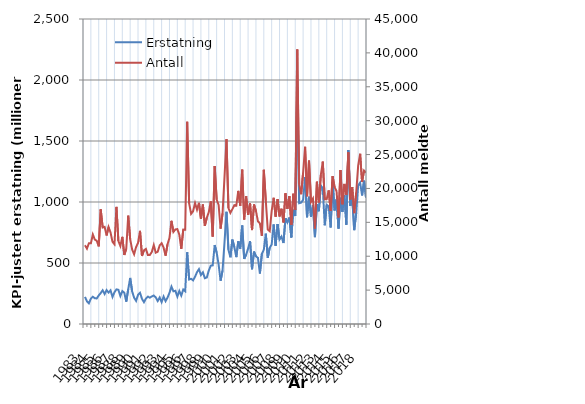
| Category | Erstatning |
|---|---|
| 1983.0 | 221.949 |
| nan | 185.917 |
| nan | 170.02 |
| nan | 208.268 |
| 1984.0 | 223.332 |
| nan | 211.256 |
| nan | 209.456 |
| nan | 234.278 |
| 1985.0 | 253.168 |
| nan | 276.72 |
| nan | 245.206 |
| nan | 278.097 |
| 1986.0 | 257.839 |
| nan | 275.898 |
| nan | 222.061 |
| nan | 259.862 |
| 1987.0 | 283.894 |
| nan | 280.151 |
| nan | 229.26 |
| nan | 269.731 |
| 1988.0 | 256.73 |
| nan | 183.009 |
| nan | 285.041 |
| nan | 377.599 |
| 1989.0 | 266.765 |
| nan | 215.61 |
| nan | 189.719 |
| nan | 239.351 |
| 1990.0 | 256.282 |
| nan | 206.18 |
| nan | 178.813 |
| nan | 208.132 |
| 1991.0 | 224.594 |
| nan | 215.946 |
| nan | 226.002 |
| nan | 233.658 |
| 1992.0 | 218.279 |
| nan | 188.082 |
| nan | 217.323 |
| nan | 179.335 |
| 1993.0 | 225.016 |
| nan | 187.263 |
| nan | 216.35 |
| nan | 255.948 |
| 1994.0 | 306.554 |
| nan | 267.998 |
| nan | 272.283 |
| nan | 224.429 |
| 1995.0 | 270.389 |
| nan | 232.615 |
| nan | 282.652 |
| nan | 268.364 |
| 1996.0 | 588.52 |
| nan | 364.421 |
| nan | 370.932 |
| nan | 357.735 |
| 1997.0 | 387.279 |
| nan | 424.973 |
| nan | 450.052 |
| nan | 401.55 |
| 1998.0 | 423.625 |
| nan | 375.292 |
| nan | 381.423 |
| nan | 438.403 |
| 1999.0 | 478.172 |
| nan | 480.494 |
| nan | 646.566 |
| nan | 585.551 |
| 2000.0 | 488.096 |
| nan | 354.465 |
| nan | 439.436 |
| nan | 670.004 |
| 2001.0 | 919.504 |
| nan | 608.715 |
| nan | 546.707 |
| nan | 691.697 |
| 2002.0 | 629.967 |
| nan | 548.133 |
| nan | 677.398 |
| nan | 617.261 |
| 2003.0 | 807.292 |
| nan | 533.752 |
| nan | 567.845 |
| nan | 618.583 |
| 2004.0 | 678.619 |
| nan | 448.657 |
| nan | 593.143 |
| nan | 554.406 |
| 2005.0 | 542.628 |
| nan | 414.1 |
| nan | 574.883 |
| nan | 609.232 |
| 2006.0 | 740.532 |
| nan | 543.078 |
| nan | 624.878 |
| nan | 651.921 |
| 2007.0 | 816.008 |
| nan | 641.555 |
| nan | 819.694 |
| nan | 693.036 |
| 2008.0 | 716.689 |
| nan | 663.474 |
| nan | 866.535 |
| nan | 832.218 |
| 2009.0 | 873.32 |
| nan | 708.997 |
| nan | 936.566 |
| nan | 885.25 |
| 2010.0 | 1941.881 |
| nan | 990.456 |
| nan | 995.22 |
| nan | 1018.153 |
| 2011.0 | 1203.27 |
| nan | 874.99 |
| nan | 1043.291 |
| nan | 879.248 |
| 2012.0 | 974.087 |
| nan | 712.146 |
| nan | 981.851 |
| nan | 924.505 |
| 2013.0 | 1135.389 |
| nan | 1111.761 |
| nan | 808.968 |
| nan | 977.139 |
| 2014.0 | 963.722 |
| nan | 791.406 |
| nan | 1164.2 |
| nan | 930.848 |
| 2015.0 | 1021.261 |
| nan | 782.106 |
| nan | 1035.286 |
| nan | 919.216 |
| 2016.0 | 1056.711 |
| nan | 813.389 |
| nan | 1426.54 |
| nan | 967.908 |
| 2017.0 | 1037.584 |
| nan | 769.551 |
| nan | 908.847 |
| nan | 1134.849 |
| 2018.0 | 1158.517 |
| nan | 1053.942 |
| nan | 1174.78 |
| nan | 1036.5 |